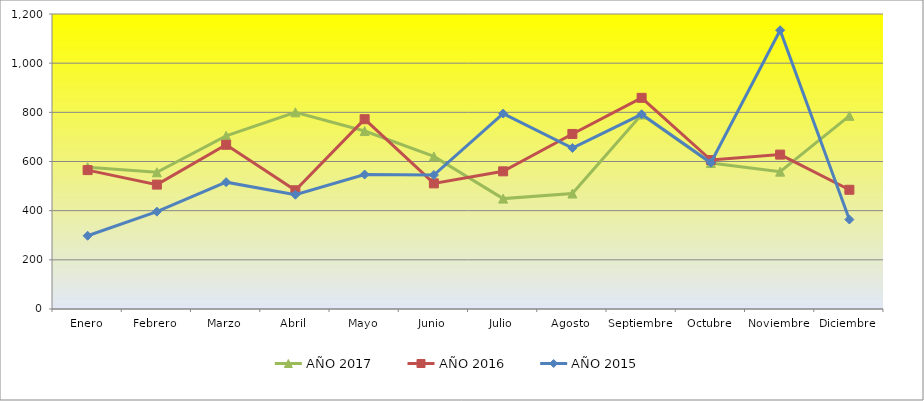
| Category | AÑO 2017 | AÑO 2016 | AÑO 2015 |
|---|---|---|---|
| Enero | 576.774 | 565 | 298 |
| Febrero | 556.129 | 506 | 396 |
| Marzo | 704.516 | 668 | 516 |
| Abril | 800 | 483 | 465 |
| Mayo | 723.871 | 772 | 547 |
| Junio | 620.645 | 511 | 545 |
| Julio | 449.032 | 560 | 795 |
| Agosto | 469.677 | 712 | 655 |
| Septiembre | 790.968 | 859 | 792 |
| Octubre | 593.75 | 606 | 595 |
| Noviembre | 558.75 | 628 | 1134 |
| Diciembre | 785.806 | 485 | 364 |